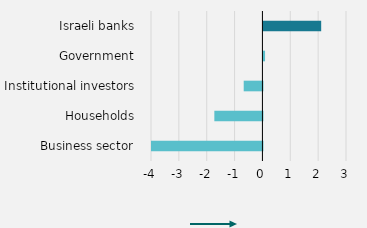
| Category | $ billion |
|---|---|
| Business sector | -4021.326 |
| Households | -1726 |
| Institutional investors | -672.223 |
| Government | 58 |
| Israeli banks | 2073.294 |